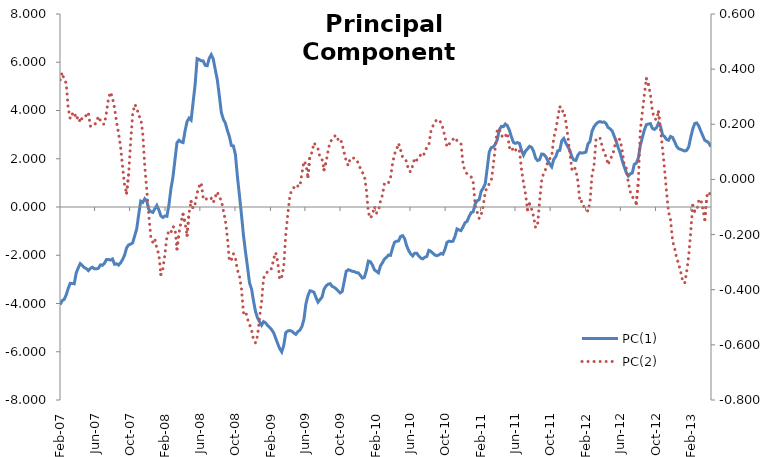
| Category | PC(1) |
|---|---|
| 2007-02-05 | -4.044 |
| 2007-02-12 | -3.879 |
| 2007-02-19 | -3.831 |
| 2007-02-26 | -3.647 |
| 2007-03-05 | -3.377 |
| 2007-03-12 | -3.161 |
| 2007-03-19 | -3.169 |
| 2007-03-26 | -3.182 |
| 2007-04-02 | -2.728 |
| 2007-04-09 | -2.519 |
| 2007-04-16 | -2.347 |
| 2007-04-23 | -2.425 |
| 2007-04-30 | -2.507 |
| 2007-05-07 | -2.556 |
| 2007-05-14 | -2.637 |
| 2007-05-21 | -2.547 |
| 2007-05-28 | -2.495 |
| 2007-06-04 | -2.56 |
| 2007-06-11 | -2.565 |
| 2007-06-18 | -2.54 |
| 2007-06-25 | -2.399 |
| 2007-07-02 | -2.416 |
| 2007-07-09 | -2.33 |
| 2007-07-16 | -2.177 |
| 2007-07-23 | -2.173 |
| 2007-07-30 | -2.201 |
| 2007-08-06 | -2.154 |
| 2007-08-13 | -2.374 |
| 2007-08-20 | -2.354 |
| 2007-08-27 | -2.408 |
| 2007-09-03 | -2.32 |
| 2007-09-10 | -2.175 |
| 2007-09-17 | -1.996 |
| 2007-09-24 | -1.688 |
| 2007-10-01 | -1.572 |
| 2007-10-08 | -1.54 |
| 2007-10-15 | -1.484 |
| 2007-10-22 | -1.197 |
| 2007-10-29 | -0.911 |
| 2007-11-05 | -0.311 |
| 2007-11-12 | 0.242 |
| 2007-11-19 | 0.19 |
| 2007-11-26 | 0.344 |
| 2007-12-03 | 0.25 |
| 2007-12-10 | -0.1 |
| 2007-12-17 | -0.193 |
| 2007-12-24 | -0.225 |
| 2007-12-31 | -0.075 |
| 2008-01-07 | 0.065 |
| 2008-01-14 | -0.124 |
| 2008-01-21 | -0.368 |
| 2008-01-28 | -0.434 |
| 2008-02-04 | -0.37 |
| 2008-02-11 | -0.386 |
| 2008-02-18 | 0.089 |
| 2008-02-25 | 0.759 |
| 2008-03-03 | 1.248 |
| 2008-03-10 | 1.962 |
| 2008-03-17 | 2.667 |
| 2008-03-24 | 2.767 |
| 2008-03-31 | 2.698 |
| 2008-04-07 | 2.67 |
| 2008-04-14 | 3.15 |
| 2008-04-21 | 3.541 |
| 2008-04-28 | 3.684 |
| 2008-05-05 | 3.601 |
| 2008-05-12 | 4.338 |
| 2008-05-19 | 5.079 |
| 2008-05-26 | 6.148 |
| 2008-06-02 | 6.116 |
| 2008-06-09 | 6.06 |
| 2008-06-16 | 6.054 |
| 2008-06-23 | 5.872 |
| 2008-06-30 | 5.855 |
| 2008-07-07 | 6.162 |
| 2008-07-14 | 6.313 |
| 2008-07-21 | 6.135 |
| 2008-07-28 | 5.694 |
| 2008-08-04 | 5.282 |
| 2008-08-11 | 4.626 |
| 2008-08-18 | 3.923 |
| 2008-08-25 | 3.638 |
| 2008-09-01 | 3.48 |
| 2008-09-08 | 3.176 |
| 2008-09-15 | 2.922 |
| 2008-09-22 | 2.55 |
| 2008-09-29 | 2.531 |
| 2008-10-06 | 2.172 |
| 2008-10-13 | 1.253 |
| 2008-10-20 | 0.487 |
| 2008-10-27 | -0.314 |
| 2008-11-03 | -1.171 |
| 2008-11-10 | -1.855 |
| 2008-11-17 | -2.478 |
| 2008-11-24 | -3.149 |
| 2008-12-01 | -3.394 |
| 2008-12-08 | -3.898 |
| 2008-12-15 | -4.34 |
| 2008-12-22 | -4.601 |
| 2008-12-29 | -4.753 |
| 2009-01-05 | -4.9 |
| 2009-01-12 | -4.752 |
| 2009-01-19 | -4.806 |
| 2009-01-26 | -4.916 |
| 2009-02-02 | -4.988 |
| 2009-02-09 | -5.089 |
| 2009-02-16 | -5.218 |
| 2009-02-23 | -5.441 |
| 2009-03-02 | -5.666 |
| 2009-03-09 | -5.874 |
| 2009-03-16 | -6.007 |
| 2009-03-23 | -5.737 |
| 2009-03-30 | -5.21 |
| 2009-04-06 | -5.137 |
| 2009-04-13 | -5.121 |
| 2009-04-20 | -5.148 |
| 2009-04-27 | -5.222 |
| 2009-05-04 | -5.279 |
| 2009-05-11 | -5.167 |
| 2009-05-18 | -5.107 |
| 2009-05-25 | -4.959 |
| 2009-06-01 | -4.664 |
| 2009-06-08 | -4.015 |
| 2009-06-15 | -3.679 |
| 2009-06-22 | -3.472 |
| 2009-06-29 | -3.492 |
| 2009-07-06 | -3.535 |
| 2009-07-13 | -3.755 |
| 2009-07-20 | -3.943 |
| 2009-07-27 | -3.841 |
| 2009-08-03 | -3.733 |
| 2009-08-10 | -3.411 |
| 2009-08-17 | -3.272 |
| 2009-08-24 | -3.204 |
| 2009-08-31 | -3.177 |
| 2009-09-07 | -3.287 |
| 2009-09-14 | -3.329 |
| 2009-09-21 | -3.39 |
| 2009-09-28 | -3.484 |
| 2009-10-05 | -3.56 |
| 2009-10-12 | -3.502 |
| 2009-10-19 | -3.085 |
| 2009-10-26 | -2.664 |
| 2009-11-02 | -2.6 |
| 2009-11-09 | -2.628 |
| 2009-11-16 | -2.665 |
| 2009-11-23 | -2.679 |
| 2009-11-30 | -2.719 |
| 2009-12-07 | -2.73 |
| 2009-12-14 | -2.832 |
| 2009-12-21 | -2.947 |
| 2009-12-28 | -2.918 |
| 2010-01-04 | -2.634 |
| 2010-01-11 | -2.241 |
| 2010-01-18 | -2.269 |
| 2010-01-25 | -2.403 |
| 2010-02-01 | -2.605 |
| 2010-02-08 | -2.667 |
| 2010-02-15 | -2.729 |
| 2010-02-22 | -2.442 |
| 2010-03-01 | -2.308 |
| 2010-03-08 | -2.158 |
| 2010-03-15 | -2.084 |
| 2010-03-22 | -1.992 |
| 2010-03-29 | -2.005 |
| 2010-04-05 | -1.698 |
| 2010-04-12 | -1.46 |
| 2010-04-19 | -1.42 |
| 2010-04-26 | -1.405 |
| 2010-05-03 | -1.219 |
| 2010-05-10 | -1.187 |
| 2010-05-17 | -1.31 |
| 2010-05-24 | -1.608 |
| 2010-05-31 | -1.806 |
| 2010-06-07 | -1.946 |
| 2010-06-14 | -2.03 |
| 2010-06-21 | -1.913 |
| 2010-06-28 | -1.913 |
| 2010-07-05 | -2.033 |
| 2010-07-12 | -2.119 |
| 2010-07-19 | -2.149 |
| 2010-07-26 | -2.085 |
| 2010-08-02 | -2.052 |
| 2010-08-09 | -1.798 |
| 2010-08-16 | -1.838 |
| 2010-08-23 | -1.915 |
| 2010-08-30 | -1.992 |
| 2010-09-06 | -2.017 |
| 2010-09-13 | -1.987 |
| 2010-09-20 | -1.925 |
| 2010-09-27 | -1.955 |
| 2010-10-04 | -1.761 |
| 2010-10-11 | -1.467 |
| 2010-10-18 | -1.416 |
| 2010-10-25 | -1.431 |
| 2010-11-01 | -1.418 |
| 2010-11-08 | -1.215 |
| 2010-11-15 | -0.908 |
| 2010-11-22 | -0.952 |
| 2010-11-29 | -0.98 |
| 2010-12-06 | -0.816 |
| 2010-12-13 | -0.647 |
| 2010-12-20 | -0.597 |
| 2010-12-27 | -0.395 |
| 2011-01-03 | -0.231 |
| 2011-01-10 | -0.202 |
| 2011-01-17 | 0.127 |
| 2011-01-24 | 0.255 |
| 2011-01-31 | 0.305 |
| 2011-02-07 | 0.652 |
| 2011-02-14 | 0.784 |
| 2011-02-21 | 0.962 |
| 2011-02-28 | 1.611 |
| 2011-03-07 | 2.285 |
| 2011-03-14 | 2.463 |
| 2011-03-21 | 2.487 |
| 2011-03-28 | 2.604 |
| 2011-04-04 | 2.794 |
| 2011-04-11 | 3.202 |
| 2011-04-18 | 3.342 |
| 2011-04-25 | 3.331 |
| 2011-05-02 | 3.439 |
| 2011-05-09 | 3.37 |
| 2011-05-16 | 3.18 |
| 2011-05-23 | 2.91 |
| 2011-05-30 | 2.676 |
| 2011-06-06 | 2.638 |
| 2011-06-13 | 2.673 |
| 2011-06-20 | 2.634 |
| 2011-06-27 | 2.353 |
| 2011-07-04 | 2.151 |
| 2011-07-11 | 2.317 |
| 2011-07-18 | 2.408 |
| 2011-07-25 | 2.517 |
| 2011-08-01 | 2.476 |
| 2011-08-08 | 2.311 |
| 2011-08-15 | 2.026 |
| 2011-08-22 | 1.924 |
| 2011-08-29 | 1.965 |
| 2011-09-05 | 2.196 |
| 2011-09-12 | 2.185 |
| 2011-09-19 | 2.1 |
| 2011-09-26 | 1.933 |
| 2011-10-03 | 1.782 |
| 2011-10-10 | 1.665 |
| 2011-10-17 | 1.969 |
| 2011-10-24 | 2.081 |
| 2011-10-31 | 2.328 |
| 2011-11-07 | 2.348 |
| 2011-11-14 | 2.745 |
| 2011-11-21 | 2.841 |
| 2011-11-28 | 2.655 |
| 2011-12-05 | 2.501 |
| 2011-12-12 | 2.352 |
| 2011-12-19 | 2.083 |
| 2011-12-26 | 1.943 |
| 2012-01-02 | 1.929 |
| 2012-01-09 | 2.15 |
| 2012-01-16 | 2.252 |
| 2012-01-23 | 2.237 |
| 2012-01-30 | 2.25 |
| 2012-02-06 | 2.274 |
| 2012-02-13 | 2.612 |
| 2012-02-20 | 2.716 |
| 2012-02-27 | 3.138 |
| 2012-03-05 | 3.326 |
| 2012-03-12 | 3.438 |
| 2012-03-19 | 3.516 |
| 2012-03-26 | 3.54 |
| 2012-04-02 | 3.513 |
| 2012-04-09 | 3.524 |
| 2012-04-16 | 3.455 |
| 2012-04-23 | 3.295 |
| 2012-04-30 | 3.243 |
| 2012-05-07 | 3.158 |
| 2012-05-14 | 2.942 |
| 2012-05-21 | 2.727 |
| 2012-05-28 | 2.46 |
| 2012-06-04 | 2.237 |
| 2012-06-11 | 1.924 |
| 2012-06-18 | 1.665 |
| 2012-06-25 | 1.432 |
| 2012-07-02 | 1.285 |
| 2012-07-09 | 1.374 |
| 2012-07-16 | 1.412 |
| 2012-07-23 | 1.771 |
| 2012-07-30 | 1.82 |
| 2012-08-06 | 2.032 |
| 2012-08-13 | 2.56 |
| 2012-08-20 | 2.88 |
| 2012-08-27 | 3.194 |
| 2012-09-03 | 3.412 |
| 2012-09-10 | 3.44 |
| 2012-09-17 | 3.458 |
| 2012-09-24 | 3.258 |
| 2012-10-01 | 3.216 |
| 2012-10-08 | 3.285 |
| 2012-10-15 | 3.472 |
| 2012-10-22 | 3.346 |
| 2012-10-29 | 2.998 |
| 2012-11-05 | 2.917 |
| 2012-11-12 | 2.799 |
| 2012-11-19 | 2.767 |
| 2012-11-26 | 2.926 |
| 2012-12-03 | 2.884 |
| 2012-12-10 | 2.714 |
| 2012-12-17 | 2.517 |
| 2012-12-24 | 2.421 |
| 2012-12-31 | 2.389 |
| 2013-01-07 | 2.355 |
| 2013-01-14 | 2.321 |
| 2013-01-21 | 2.349 |
| 2013-01-28 | 2.489 |
| 2013-02-04 | 2.882 |
| 2013-02-11 | 3.228 |
| 2013-02-18 | 3.46 |
| 2013-02-25 | 3.486 |
| 2013-03-04 | 3.357 |
| 2013-03-11 | 3.147 |
| 2013-03-18 | 2.95 |
| 2013-03-25 | 2.761 |
| 2013-04-01 | 2.722 |
| 2013-04-08 | 2.656 |
| 2013-04-15 | 2.501 |